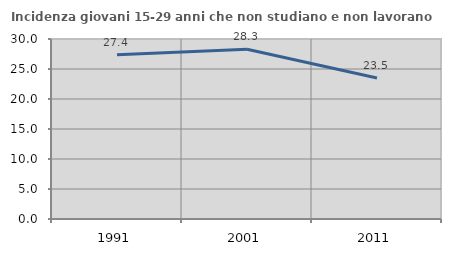
| Category | Incidenza giovani 15-29 anni che non studiano e non lavorano  |
|---|---|
| 1991.0 | 27.381 |
| 2001.0 | 28.302 |
| 2011.0 | 23.509 |